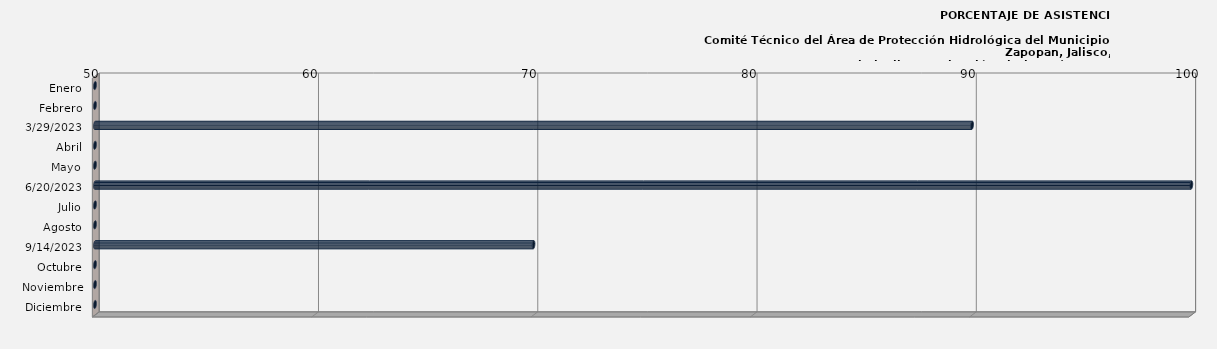
| Category | Enero |
|---|---|
| Enero | 0 |
| Febrero | 0 |
| 29/03/2023 | 90 |
| Abril | 0 |
| Mayo | 0 |
| 20/06/2023 | 100 |
| Julio | 0 |
| Agosto | 0 |
| 14/09/2023 | 70 |
| Octubre | 0 |
| Noviembre | 0 |
| Diciembre | 0 |